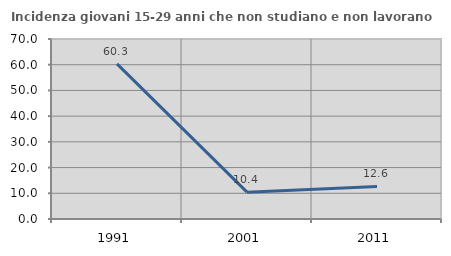
| Category | Incidenza giovani 15-29 anni che non studiano e non lavorano  |
|---|---|
| 1991.0 | 60.345 |
| 2001.0 | 10.441 |
| 2011.0 | 12.644 |